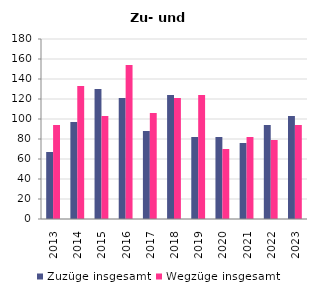
| Category | Zuzüge insgesamt | Wegzüge insgesamt |
|---|---|---|
| 2013.0 | 67 | 94 |
| 2014.0 | 97 | 133 |
| 2015.0 | 130 | 103 |
| 2016.0 | 121 | 154 |
| 2017.0 | 88 | 106 |
| 2018.0 | 124 | 121 |
| 2019.0 | 82 | 124 |
| 2020.0 | 82 | 70 |
| 2021.0 | 76 | 82 |
| 2022.0 | 94 | 79 |
| 2023.0 | 103 | 94 |